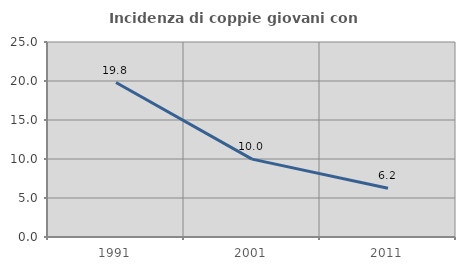
| Category | Incidenza di coppie giovani con figli |
|---|---|
| 1991.0 | 19.805 |
| 2001.0 | 9.985 |
| 2011.0 | 6.241 |